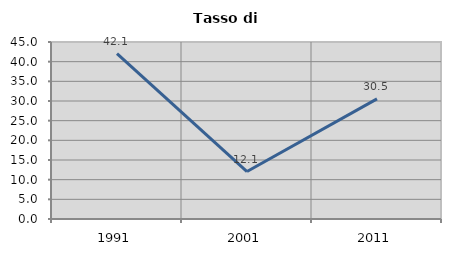
| Category | Tasso di disoccupazione   |
|---|---|
| 1991.0 | 42.056 |
| 2001.0 | 12.069 |
| 2011.0 | 30.55 |